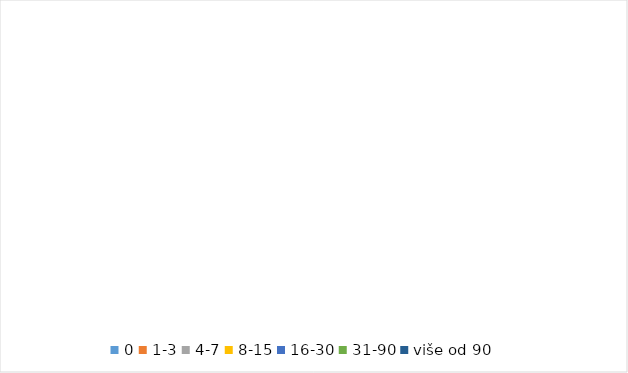
| Category | Series 0 |
|---|---|
| 0 | 0 |
| 1-3 | 0 |
| 4-7 | 0 |
| 8-15 | 0 |
| 16-30 | 0 |
| 31-90 | 0 |
| više od 90 | 0 |